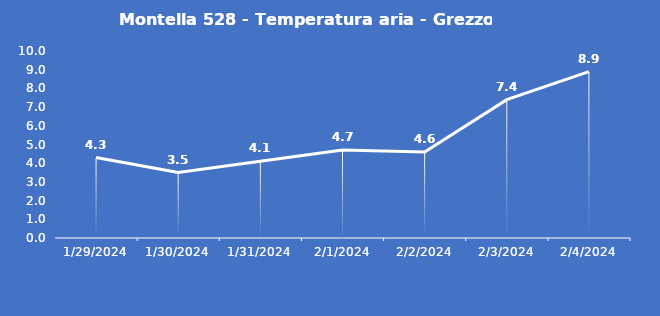
| Category | Montella 528 - Temperatura aria - Grezzo (°C) |
|---|---|
| 1/29/24 | 4.3 |
| 1/30/24 | 3.5 |
| 1/31/24 | 4.1 |
| 2/1/24 | 4.7 |
| 2/2/24 | 4.6 |
| 2/3/24 | 7.4 |
| 2/4/24 | 8.9 |